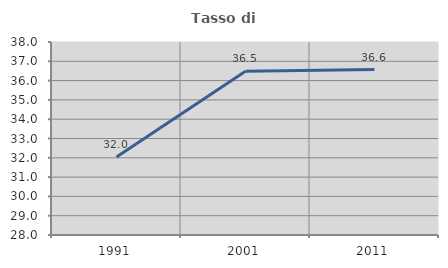
| Category | Tasso di occupazione   |
|---|---|
| 1991.0 | 32.044 |
| 2001.0 | 36.482 |
| 2011.0 | 36.574 |